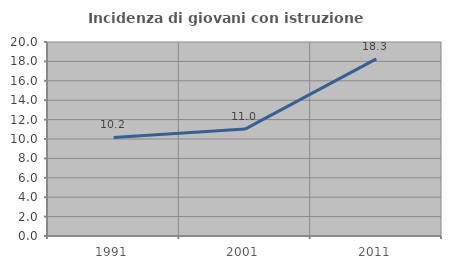
| Category | Incidenza di giovani con istruzione universitaria |
|---|---|
| 1991.0 | 10.156 |
| 2001.0 | 11.024 |
| 2011.0 | 18.261 |